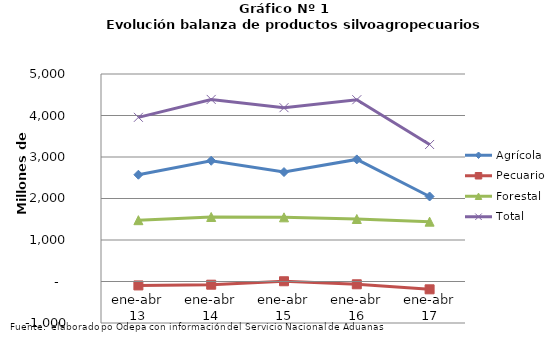
| Category | Agrícola | Pecuario | Forestal | Total |
|---|---|---|---|---|
| ene-abr 13 | 2572714 | -94600 | 1477696 | 3955810 |
| ene-abr 14 | 2909610 | -77047 | 1554704 | 4387267 |
| ene-abr 15 | 2637121 | 5906 | 1545961 | 4188988 |
| ene-abr 16 | 2941961 | -67211 | 1505875 | 4380625 |
| ene-abr 17 | 2048446 | -188539 | 1441656 | 3301563 |